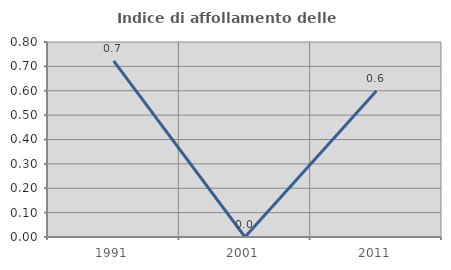
| Category | Indice di affollamento delle abitazioni  |
|---|---|
| 1991.0 | 0.723 |
| 2001.0 | 0 |
| 2011.0 | 0.599 |